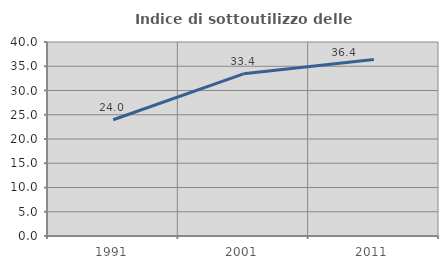
| Category | Indice di sottoutilizzo delle abitazioni  |
|---|---|
| 1991.0 | 23.969 |
| 2001.0 | 33.438 |
| 2011.0 | 36.387 |